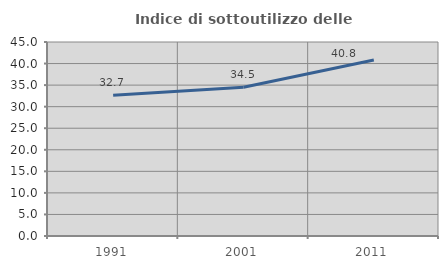
| Category | Indice di sottoutilizzo delle abitazioni  |
|---|---|
| 1991.0 | 32.677 |
| 2001.0 | 34.488 |
| 2011.0 | 40.804 |